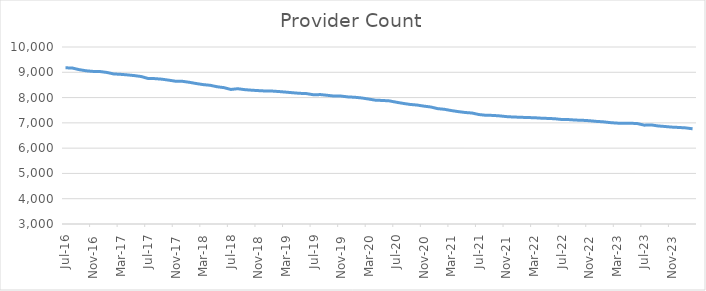
| Category | Series 0 |
|---|---|
| 2016-07-01 | 9178 |
| 2016-08-01 | 9168 |
| 2016-09-01 | 9104 |
| 2016-10-01 | 9059 |
| 2016-11-01 | 9035 |
| 2016-12-01 | 9030 |
| 2017-01-01 | 8994 |
| 2017-02-01 | 8935 |
| 2017-03-01 | 8919 |
| 2017-04-01 | 8897 |
| 2017-05-01 | 8869 |
| 2017-06-01 | 8832 |
| 2017-07-01 | 8754 |
| 2017-08-01 | 8749 |
| 2017-09-01 | 8727 |
| 2017-10-01 | 8688 |
| 2017-11-01 | 8646 |
| 2017-12-01 | 8642 |
| 2018-01-01 | 8603 |
| 2018-02-01 | 8554 |
| 2018-03-01 | 8512 |
| 2018-04-01 | 8486 |
| 2018-05-01 | 8428 |
| 2018-06-01 | 8393 |
| 2018-07-01 | 8321 |
| 2018-08-01 | 8350 |
| 2018-09-01 | 8314 |
| 2018-10-01 | 8292 |
| 2018-11-01 | 8275 |
| 2018-12-01 | 8260 |
| 2019-01-01 | 8257 |
| 2019-02-01 | 8238 |
| 2019-03-01 | 8215 |
| 2019-04-01 | 8190 |
| 2019-05-01 | 8168 |
| 2019-06-01 | 8156 |
| 2019-07-01 | 8111 |
| 2019-08-01 | 8118 |
| 2019-09-01 | 8090 |
| 2019-10-01 | 8059 |
| 2019-11-01 | 8058 |
| 2019-12-01 | 8026 |
| 2020-01-01 | 8012 |
| 2020-02-01 | 7984 |
| 2020-03-01 | 7942 |
| 2020-04-01 | 7896 |
| 2020-05-01 | 7886 |
| 2020-06-01 | 7869 |
| 2020-07-01 | 7817 |
| 2020-08-01 | 7770 |
| 2020-09-01 | 7729 |
| 2020-10-01 | 7705 |
| 2020-11-01 | 7662 |
| 2020-12-01 | 7628 |
| 2021-01-01 | 7563 |
| 2021-02-01 | 7536 |
| 2021-03-01 | 7486 |
| 2021-04-01 | 7445 |
| 2021-05-01 | 7410 |
| 2021-06-01 | 7389 |
| 2021-07-01 | 7329 |
| 2021-08-01 | 7300 |
| 2021-09-01 | 7295 |
| 2021-10-01 | 7276 |
| 2021-11-01 | 7247 |
| 2021-12-01 | 7231 |
| 2022-01-01 | 7222 |
| 2022-02-01 | 7210 |
| 2022-03-01 | 7204 |
| 2022-04-01 | 7186 |
| 2022-05-01 | 7175 |
| 2022-06-01 | 7163 |
| 2022-07-01 | 7133 |
| 2022-08-01 | 7130 |
| 2022-09-01 | 7110 |
| 2022-10-01 | 7102 |
| 2022-11-01 | 7085 |
| 2022-12-01 | 7059 |
| 2023-01-01 | 7042 |
| 2023-02-01 | 7011 |
| 2023-03-01 | 6990 |
| 2023-04-01 | 6983 |
| 2023-05-01 | 6986 |
| 2023-06-01 | 6971 |
| 2023-07-01 | 6909 |
| 2023-08-01 | 6918 |
| 2023-09-01 | 6878 |
| 2023-10-01 | 6856 |
| 2023-11-01 | 6832 |
| 2023-12-01 | 6818 |
| 2024-01-01 | 6801 |
| 2024-02-01 | 6766 |